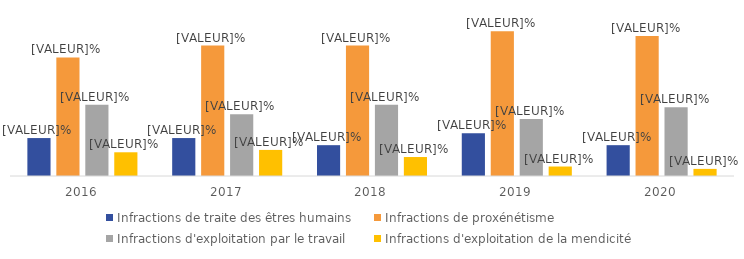
| Category | Infractions de traite des êtres humains | Infractions de proxénétisme | Infractions d'exploitation par le travail | Infractions d'exploitation de la mendicité |
|---|---|---|---|---|
| 2016.0 | 16 | 50 | 30 | 10 |
| 2017.0 | 16 | 55 | 26 | 11 |
| 2018.0 | 13 | 55 | 30 | 8 |
| 2019.0 | 18 | 61 | 24 | 4 |
| 2020.0 | 13 | 59 | 29 | 3 |